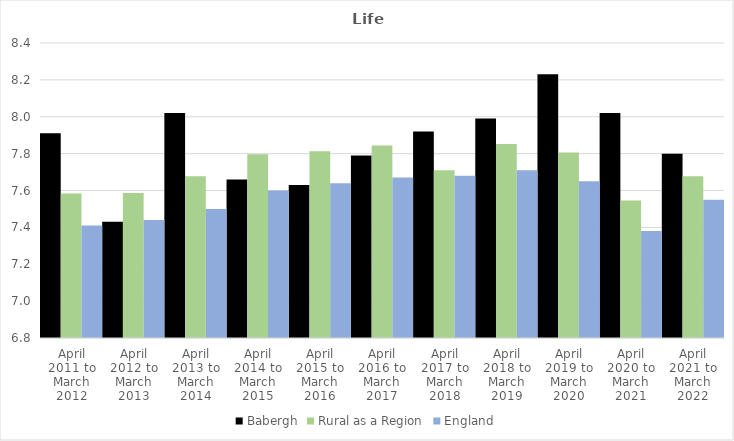
| Category | Babergh | Rural as a Region | England |
|---|---|---|---|
| April 2011 to March 2012 | 7.91 | 7.584 | 7.41 |
| April 2012 to March 2013 | 7.43 | 7.586 | 7.44 |
| April 2013 to March 2014 | 8.02 | 7.677 | 7.5 |
| April 2014 to March 2015 | 7.66 | 7.797 | 7.6 |
| April 2015 to March 2016 | 7.63 | 7.813 | 7.64 |
| April 2016 to March 2017 | 7.79 | 7.845 | 7.67 |
| April 2017 to March 2018 | 7.92 | 7.71 | 7.68 |
| April 2018 to March 2019 | 7.99 | 7.852 | 7.71 |
| April 2019 to March 2020 | 8.23 | 7.806 | 7.65 |
| April 2020 to March 2021 | 8.02 | 7.546 | 7.38 |
| April 2021 to March 2022 | 7.8 | 7.677 | 7.55 |